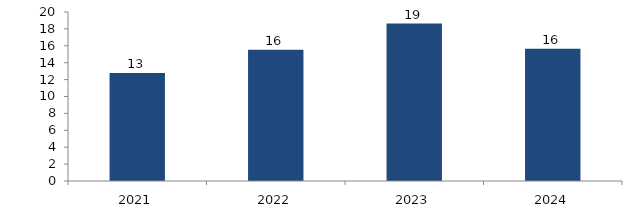
| Category | Bogotá |
|---|---|
| 2021.0 | 12.792 |
| 2022.0 | 15.525 |
| 2023.0 | 18.632 |
| 2024.0 | 15.665 |